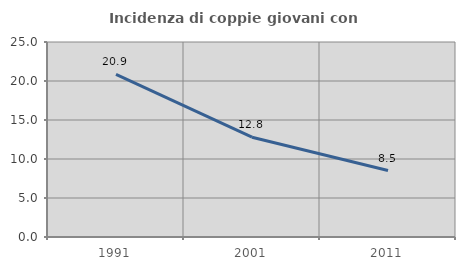
| Category | Incidenza di coppie giovani con figli |
|---|---|
| 1991.0 | 20.85 |
| 2001.0 | 12.791 |
| 2011.0 | 8.523 |